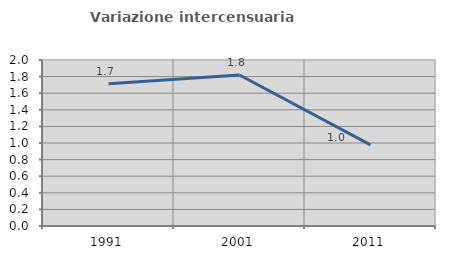
| Category | Variazione intercensuaria annua |
|---|---|
| 1991.0 | 1.714 |
| 2001.0 | 1.819 |
| 2011.0 | 0.977 |